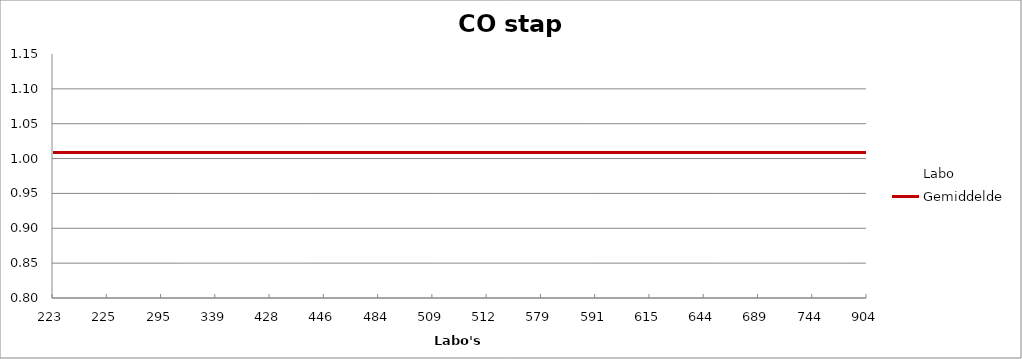
| Category | Labo | Gemiddelde |
|---|---|---|
| 223.0 | 1.018 | 1.009 |
| 225.0 | 0.976 | 1.009 |
| 295.0 | 1.01 | 1.009 |
| 339.0 | 1.022 | 1.009 |
| 428.0 | 0.997 | 1.009 |
| 446.0 | 1.005 | 1.009 |
| 484.0 | 1.053 | 1.009 |
| 509.0 | 1.012 | 1.009 |
| 512.0 | 0.983 | 1.009 |
| 579.0 | 1.051 | 1.009 |
| 591.0 | 0.976 | 1.009 |
| 615.0 | 1.047 | 1.009 |
| 644.0 | 1.147 | 1.009 |
| 689.0 | 0.977 | 1.009 |
| 744.0 | 0.814 | 1.009 |
| 904.0 | 0.996 | 1.009 |